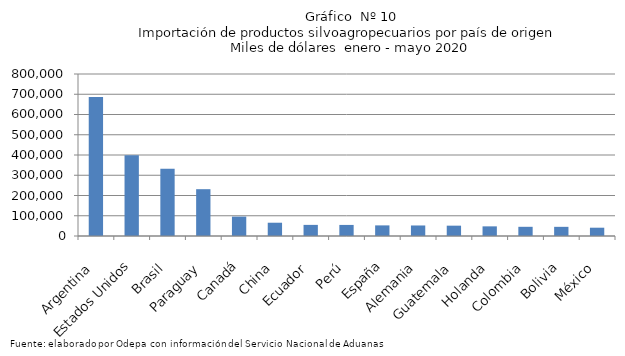
| Category | Series 0 |
|---|---|
| Argentina | 685871.566 |
| Estados Unidos | 398291.397 |
| Brasil | 331652.497 |
| Paraguay | 231180.618 |
| Canadá | 95731.21 |
| China | 65583.942 |
| Ecuador | 54890.838 |
| Perú | 54682.74 |
| España | 52413.941 |
| Alemania | 51967.855 |
| Guatemala | 51038.009 |
| Holanda | 47618.636 |
| Colombia | 45406.441 |
| Bolivia | 45254.256 |
| México | 40975.07 |